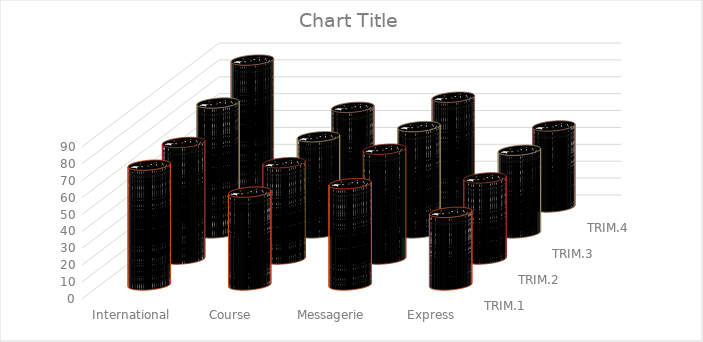
| Category | TRIM.1 | TRIM.2 | TRIM.3 | TRIM.4 |
|---|---|---|---|---|
| International | 71 | 69 | 77 | 87 |
| Course | 55 | 57 | 57 | 59 |
| Messagerie | 60 | 65 | 63 | 65 |
| Express | 43 | 48 | 49 | 48 |